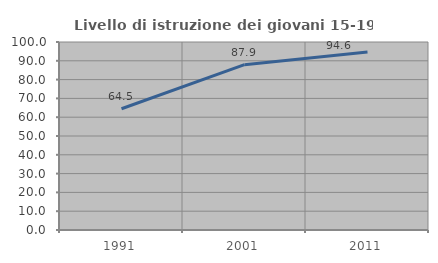
| Category | Livello di istruzione dei giovani 15-19 anni |
|---|---|
| 1991.0 | 64.501 |
| 2001.0 | 87.925 |
| 2011.0 | 94.623 |